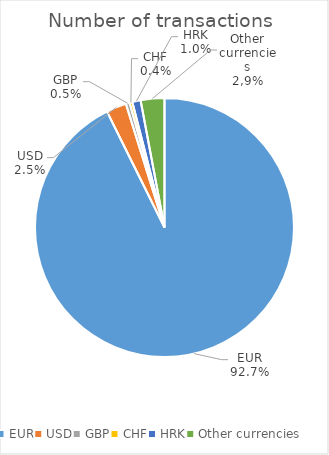
| Category | Number of transactions  |
|---|---|
| EUR | 4222666 |
| USD | 114366 |
| GBP | 21185 |
| CHF | 16040 |
| HRK | 47503 |
| Other currencies | 134796 |